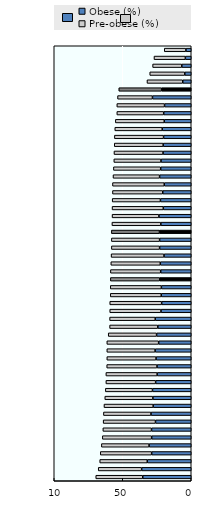
| Category | Obese (%) | Pre-obese (%) |
|---|---|---|
| Saudi Arabia | 35.4 | 34.3 |
| United States | 36.2 | 31.7 |
| Turkey | 32.1 | 34.7 |
| Malta | 28.9 | 37.5 |
| New Zealand | 30.8 | 34.8 |
| Mexico | 28.9 | 36 |
| Australia | 29 | 35.5 |
| Israel | 26.1 | 38.2 |
| Canada | 29.4 | 34.7 |
| United Kingdom | 27.8 | 35.9 |
| Chile | 28 | 35.1 |
| Argentina | 28.3 | 34.4 |
| Czech Republic | 26 | 36.3 |
| Greece | 24.9 | 37.4 |
| Bulgaria | 25 | 36.7 |
| Costa Rica | 25.7 | 35.9 |
| Hungary | 26.4 | 35.2 |
| Spain | 23.8 | 37.8 |
| Ireland | 25.3 | 35.3 |
| Croatia | 24.4 | 35.2 |
| Lithuania | 26.3 | 33.3 |
| Belgium | 22.1 | 37.4 |
| France | 21.6 | 37.9 |
| Iceland | 21.9 | 37.2 |
| Cyprus | 21.8 | 37.3 |
| EU28 average | 23 | 36.025 |
| Colombia | 22.3 | 36.7 |
| Luxembourg | 22.6 | 36.1 |
| Italy | 19.9 | 38.6 |
| Norway | 23.1 | 35.2 |
| Poland | 23.1 | 35.2 |
| OECD average | 23.206 | 35.089 |
| Finland | 22.2 | 35.7 |
| Latvia | 23.6 | 34.2 |
| Netherlands | 20.4 | 37.4 |
| Romania | 22.5 | 35.2 |
| Portugal | 20.8 | 36.7 |
| Peru | 19.7 | 37.8 |
| Russian Federation | 23.1 | 34 |
| Germany | 22.3 | 34.5 |
| Brazil | 22.1 | 34.4 |
| Sweden | 20.6 | 35.8 |
| Slovakia | 20.5 | 35.7 |
| Slovenia | 20.2 | 35.9 |
| Estonia | 21.2 | 34.6 |
| Denmark | 19.7 | 35.7 |
| Austria | 20.1 | 34.2 |
| Switzerland | 19.5 | 34.8 |
| South Africa | 28.3 | 25.5 |
| G20 average | 21.6 | 31.253 |
| China | 6.2 | 26.1 |
| Korea | 4.7 | 25.6 |
| Indonesia | 6.9 | 21.3 |
| Japan | 4.3 | 22.9 |
| India | 3.9 | 15.8 |